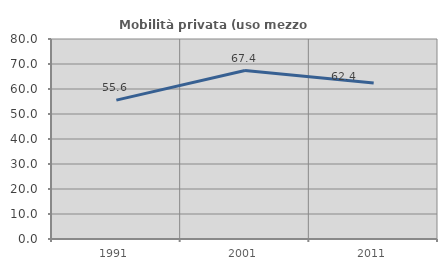
| Category | Mobilità privata (uso mezzo privato) |
|---|---|
| 1991.0 | 55.556 |
| 2001.0 | 67.385 |
| 2011.0 | 62.366 |